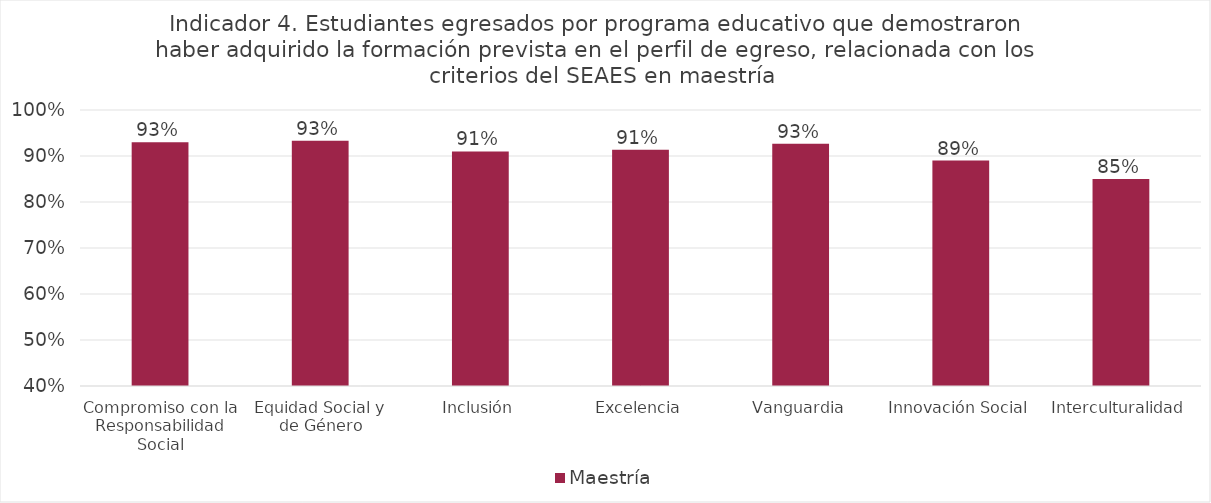
| Category | Maestría |
|---|---|
| Compromiso con la Responsabilidad Social | 0.93 |
| Equidad Social y de Género | 0.933 |
| Inclusión | 0.91 |
| Excelencia | 0.913 |
| Vanguardia | 0.927 |
| Innovación Social | 0.89 |
| Interculturalidad | 0.85 |